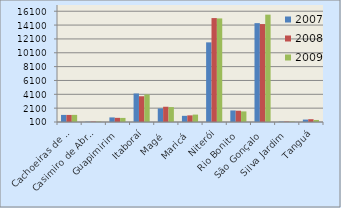
| Category | 2007 | 2008 | 2009 |
|---|---|---|---|
| Cachoeiras de Macacu | 1124 | 1120 | 1129 |
| Casimiro de Abreu | 141 | 164 | 165 |
| Guapimirim | 763 | 700 | 689 |
| Itaboraí | 4220 | 3820 | 4082 |
| Magé | 2062 | 2303 | 2254 |
| Maricá | 992 | 1058 | 1168 |
| Niterói | 11604 | 15112 | 15062 |
| Rio Bonito | 1770 | 1729 | 1630 |
| São Gonçalo | 14380 | 14246 | 15606 |
| Silva Jardim | 155 | 164 | 164 |
| Tanguá | 449 | 504 | 395 |